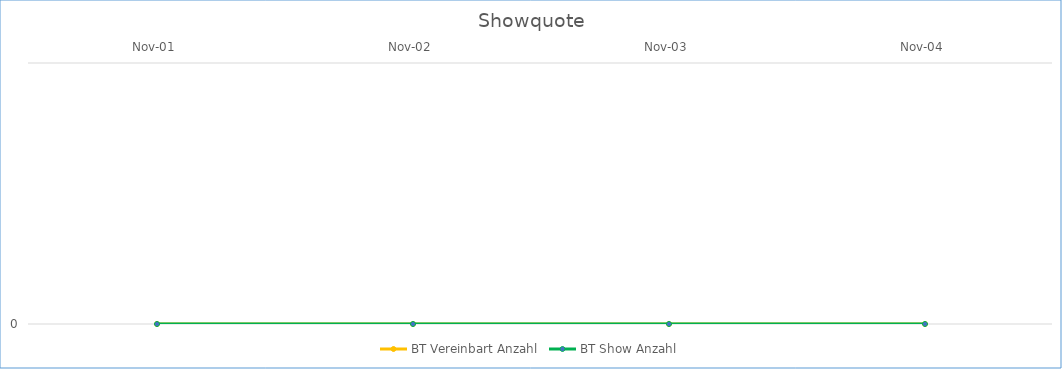
| Category | BT Vereinbart Anzahl | BT Show Anzahl |
|---|---|---|
| 2001-11-01 | 0 | 0 |
| 2002-11-01 | 0 | 0 |
| 2003-11-01 | 0 | 0 |
| 2004-11-01 | 0 | 0 |